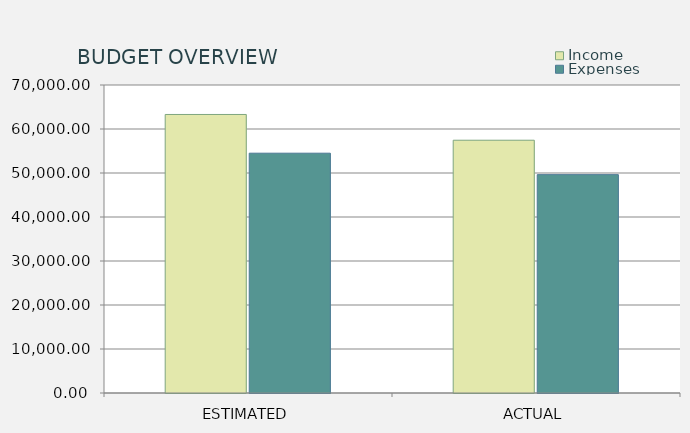
| Category | Income | Expenses |
|---|---|---|
| ESTIMATED | 63300 | 54500 |
| ACTUAL | 57450 | 49630 |